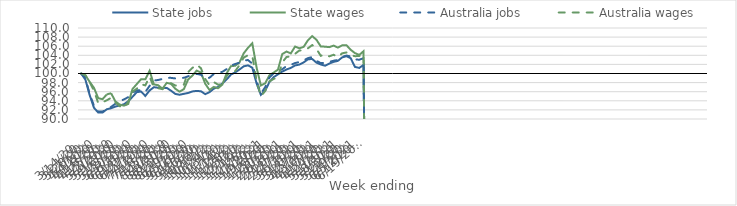
| Category | State jobs | State wages | Australia jobs | Australia wages |
|---|---|---|---|---|
| 14/03/2020 | 100 | 100 | 100 | 100 |
| 21/03/2020 | 98.642 | 99.597 | 98.971 | 99.604 |
| 28/03/2020 | 95.23 | 98.165 | 95.467 | 98.106 |
| 04/04/2020 | 92.464 | 96.84 | 92.922 | 96.239 |
| 11/04/2020 | 91.411 | 94.572 | 91.648 | 93.488 |
| 18/04/2020 | 91.415 | 94.359 | 91.632 | 93.693 |
| 25/04/2020 | 92.142 | 95.404 | 92.163 | 94.114 |
| 02/05/2020 | 92.363 | 95.667 | 92.661 | 94.661 |
| 09/05/2020 | 92.731 | 93.876 | 93.345 | 93.586 |
| 16/05/2020 | 92.975 | 93.183 | 93.938 | 92.82 |
| 23/05/2020 | 93.233 | 92.93 | 94.296 | 92.472 |
| 30/05/2020 | 93.901 | 93.296 | 94.804 | 93.802 |
| 06/06/2020 | 94.87 | 96.594 | 95.79 | 95.983 |
| 13/06/2020 | 95.901 | 97.667 | 96.291 | 96.659 |
| 20/06/2020 | 96.035 | 98.735 | 96.307 | 97.626 |
| 27/06/2020 | 95.071 | 98.728 | 95.924 | 97.398 |
| 04/07/2020 | 96.273 | 100.583 | 97.286 | 99.305 |
| 11/07/2020 | 96.99 | 97.606 | 98.453 | 96.936 |
| 18/07/2020 | 96.865 | 97.429 | 98.574 | 96.771 |
| 25/07/2020 | 96.775 | 96.646 | 98.8 | 96.557 |
| 01/08/2020 | 96.84 | 97.944 | 99.036 | 97.398 |
| 08/08/2020 | 96.226 | 97.741 | 99.039 | 97.865 |
| 15/08/2020 | 95.516 | 96.65 | 98.915 | 97.373 |
| 22/08/2020 | 95.324 | 96.014 | 99.01 | 97.336 |
| 29/08/2020 | 95.536 | 96.554 | 99.05 | 97.544 |
| 05/09/2020 | 95.718 | 98.678 | 99.381 | 100.291 |
| 12/09/2020 | 96.059 | 99.545 | 99.754 | 101.228 |
| 19/09/2020 | 96.178 | 100.632 | 99.918 | 101.971 |
| 26/09/2020 | 96.092 | 100.209 | 99.725 | 101.154 |
| 03/10/2020 | 95.461 | 97.749 | 98.937 | 98.795 |
| 10/10/2020 | 95.898 | 96.378 | 99.064 | 97.403 |
| 17/10/2020 | 96.672 | 97.051 | 99.896 | 98.12 |
| 24/10/2020 | 97.033 | 96.759 | 100.185 | 97.546 |
| 31/10/2020 | 97.817 | 97.568 | 100.363 | 97.615 |
| 07/11/2020 | 98.687 | 100.025 | 100.966 | 99.446 |
| 14/11/2020 | 99.758 | 101.6 | 101.741 | 100.424 |
| 21/11/2020 | 100.24 | 101.705 | 102.085 | 100.522 |
| 28/11/2020 | 100.873 | 102.414 | 102.383 | 101.813 |
| 05/12/2020 | 101.58 | 104.441 | 102.872 | 103.509 |
| 12/12/2020 | 101.792 | 105.653 | 102.957 | 104.014 |
| 19/12/2020 | 101.274 | 106.647 | 102.168 | 103.915 |
| 26/12/2020 | 97.829 | 101.323 | 98.391 | 98.452 |
| 02/01/2021 | 95.305 | 97.367 | 95.58 | 95.006 |
| 09/01/2021 | 96.185 | 97.83 | 96.988 | 96.148 |
| 16/01/2021 | 98.13 | 99.607 | 99.101 | 98.251 |
| 23/01/2021 | 99.207 | 100.206 | 100.068 | 98.817 |
| 30/01/2021 | 99.814 | 100.854 | 100.556 | 99.148 |
| 06/02/2021 | 100.424 | 104.261 | 100.923 | 102.467 |
| 13/02/2021 | 100.886 | 104.829 | 101.643 | 103.619 |
| 20/02/2021 | 101.229 | 104.416 | 101.902 | 103.78 |
| 27/02/2021 | 101.775 | 105.924 | 102.3 | 104.333 |
| 06/03/2021 | 101.959 | 105.544 | 102.521 | 105.064 |
| 13/03/2021 | 102.436 | 105.854 | 102.877 | 105.052 |
| 20/03/2021 | 103.107 | 107.3 | 103.384 | 105.539 |
| 27/03/2021 | 103.201 | 108.21 | 103.612 | 106.245 |
| 03/04/2021 | 102.376 | 107.406 | 102.769 | 105.395 |
| 10/04/2021 | 101.978 | 105.955 | 102.293 | 103.884 |
| 17/04/2021 | 101.715 | 105.894 | 102.308 | 104.211 |
| 24/04/2021 | 102.183 | 105.793 | 102.558 | 103.772 |
| 01/05/2021 | 102.557 | 106.131 | 102.806 | 104.122 |
| 08/05/2021 | 102.773 | 105.694 | 102.974 | 103.594 |
| 15/05/2021 | 103.542 | 106.186 | 103.642 | 104.439 |
| 22/05/2021 | 103.805 | 106.229 | 103.934 | 104.625 |
| 29/05/2021 | 103.352 | 105.197 | 103.744 | 104.038 |
| 05/06/2021 | 101.44 | 104.481 | 103.091 | 103.805 |
| 12/06/2021 | 101.228 | 104.077 | 103.033 | 103.851 |
| 19/06/2021 | 101.882 | 104.898 | 103.366 | 104.254 |